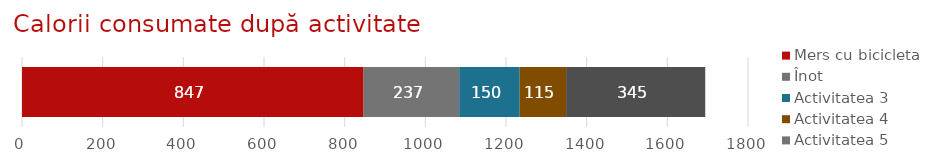
| Category | Mers cu bicicleta | Înot | Activitatea 3 | Activitatea 4 | Activitatea 5 |
|---|---|---|---|---|---|
| Monitorizare activități | 847 | 237 | 150 | 115 | 345 |